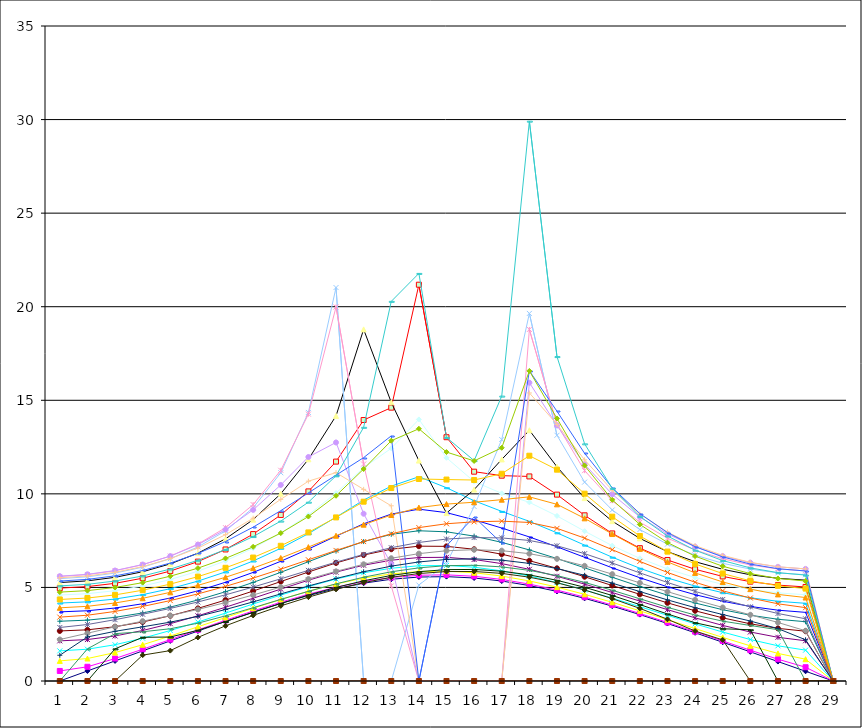
| Category | Series 0 | Series 1 | Series 2 | Series 3 | Series 4 | Series 5 | Series 6 | Series 7 | Series 8 | Series 9 | Series 10 | Series 11 | Series 12 | Series 13 | Series 14 | Series 15 | Series 16 | Series 17 | Series 18 | Series 19 | Series 20 | Series 21 | Series 22 | Series 23 | Series 24 | Series 25 | Series 26 | Series 27 | Series 28 |
|---|---|---|---|---|---|---|---|---|---|---|---|---|---|---|---|---|---|---|---|---|---|---|---|---|---|---|---|---|---|
| 0 | 0 | 0.537 | 1.074 | 1.61 | 2.145 | 2.675 | 3.194 | 3.694 | 4.165 | 4.593 | 4.963 | 5.26 | 5.471 | 5.586 | 5.601 | 5.517 | 5.341 | 5.082 | 4.751 | 4.357 | 3.91 | 3.413 | 2.859 | 2.215 | 1.375 | 0 | 0 | 0 | 0 |
| 1 | 0.537 | 0.759 | 1.201 | 1.699 | 2.215 | 2.735 | 3.251 | 3.754 | 4.23 | 4.666 | 5.045 | 5.351 | 5.568 | 5.686 | 5.7 | 5.613 | 5.431 | 5.165 | 4.829 | 4.433 | 3.991 | 3.514 | 3.019 | 2.553 | 2.354 | 1.715 | 0 | 0 | 0 |
| 2 | 1.074 | 1.201 | 1.519 | 1.938 | 2.407 | 2.899 | 3.401 | 3.899 | 4.38 | 4.826 | 5.22 | 5.54 | 5.768 | 5.891 | 5.904 | 5.809 | 5.617 | 5.342 | 4.998 | 4.601 | 4.168 | 3.718 | 3.278 | 2.897 | 2.656 | 2.53 | 1.719 | 0 | 0 |
| 3 | 1.609 | 1.698 | 1.938 | 2.284 | 2.698 | 3.155 | 3.636 | 4.128 | 4.614 | 5.077 | 5.493 | 5.837 | 6.084 | 6.214 | 6.222 | 6.114 | 5.905 | 5.613 | 5.256 | 4.852 | 4.42 | 3.984 | 3.566 | 3.197 | 2.896 | 2.632 | 2.336 | 1.384 | 0 |
| 4 | 2.143 | 2.212 | 2.405 | 2.697 | 3.064 | 3.486 | 3.948 | 4.436 | 4.933 | 5.421 | 5.874 | 6.259 | 6.536 | 6.677 | 6.673 | 6.54 | 6.301 | 5.981 | 5.599 | 5.178 | 4.737 | 4.297 | 3.879 | 3.495 | 3.145 | 2.791 | 2.35 | 1.624 | 0 |
| 5 | 2.67 | 2.73 | 2.895 | 3.151 | 3.484 | 3.881 | 4.329 | 4.819 | 5.337 | 5.867 | 6.379 | 6.831 | 7.161 | 7.315 | 7.283 | 7.102 | 6.814 | 6.45 | 6.03 | 5.577 | 5.111 | 4.655 | 4.223 | 3.824 | 3.453 | 3.091 | 2.711 | 2.329 | 0 |
| 6 | 3.185 | 3.243 | 3.393 | 3.629 | 3.942 | 4.325 | 4.771 | 5.275 | 5.829 | 6.422 | 7.029 | 7.596 | 8.025 | 8.192 | 8.091 | 7.819 | 7.454 | 7.026 | 6.552 | 6.049 | 5.543 | 5.057 | 4.605 | 4.193 | 3.82 | 3.481 | 3.178 | 2.948 | 0 |
| 7 | 3.681 | 3.74 | 3.886 | 4.114 | 4.422 | 4.807 | 5.267 | 5.802 | 6.412 | 7.098 | 7.85 | 8.622 | 9.255 | 9.427 | 9.145 | 8.699 | 8.221 | 7.719 | 7.171 | 6.597 | 6.031 | 5.5 | 5.02 | 4.596 | 4.228 | 3.915 | 3.666 | 3.504 | 0 |
| 8 | 4.146 | 4.21 | 4.359 | 4.592 | 4.91 | 5.314 | 5.807 | 6.397 | 7.091 | 7.907 | 8.873 | 10.006 | 11.128 | 11.259 | 10.477 | 9.707 | 9.103 | 8.543 | 7.904 | 7.226 | 6.571 | 5.978 | 5.46 | 5.02 | 4.653 | 4.36 | 4.143 | 4.014 | 0 |
| 9 | 4.568 | 4.639 | 4.797 | 5.044 | 5.384 | 5.824 | 6.375 | 7.051 | 7.873 | 8.875 | 10.132 | 11.847 | 14.349 | 14.26 | 11.97 | 10.677 | 10.053 | 9.555 | 8.788 | 7.941 | 7.155 | 6.477 | 5.91 | 5.447 | 5.076 | 4.791 | 4.592 | 4.481 | 0 |
| 10 | 4.933 | 5.012 | 5.183 | 5.449 | 5.819 | 6.309 | 6.94 | 7.74 | 8.754 | 10.044 | 11.724 | 14.165 | 21.025 | 19.985 | 12.746 | 11.135 | 10.999 | 10.964 | 9.899 | 8.741 | 7.762 | 6.977 | 6.352 | 5.859 | 5.477 | 5.193 | 5.001 | 4.898 | 0 |
| 11 | 5.226 | 5.314 | 5.497 | 5.783 | 6.187 | 6.731 | 7.451 | 8.401 | 9.667 | 11.398 | 13.945 | 18.788 | 0 | 11.593 | 8.938 | 10.24 | 11.936 | 13.555 | 11.329 | 9.582 | 8.354 | 7.451 | 6.764 | 6.237 | 5.837 | 5.546 | 5.355 | 5.256 | 0 |
| 12 | 5.437 | 5.53 | 5.723 | 6.025 | 6.455 | 7.043 | 7.837 | 8.918 | 10.411 | 12.432 | 14.606 | 14.889 | 0 | 5.08 | 6.253 | 9.36 | 13.1 | 20.286 | 12.839 | 10.311 | 8.87 | 7.867 | 7.122 | 6.559 | 6.138 | 5.836 | 5.64 | 5.542 | 0 |
| 13 | 5.555 | 5.651 | 5.848 | 6.158 | 6.599 | 7.204 | 8.028 | 9.181 | 10.914 | 13.977 | 21.176 | 11.777 | 5.127 | 0 | 0 | 0 | 0 | 21.779 | 13.478 | 10.794 | 9.265 | 8.197 | 7.403 | 6.806 | 6.362 | 6.046 | 5.843 | 5.743 | 0 |
| 14 | 5.577 | 5.673 | 5.869 | 6.175 | 6.609 | 7.195 | 7.973 | 8.996 | 10.327 | 11.927 | 13.027 | 8.972 | 6.268 | 0 | 0 | 0 | 7.228 | 13.014 | 12.233 | 10.764 | 9.454 | 8.402 | 7.585 | 6.961 | 6.495 | 6.165 | 5.952 | 5.848 | 0 |
| 15 | 5.504 | 5.596 | 5.786 | 6.08 | 6.493 | 7.04 | 7.742 | 8.613 | 9.633 | 10.654 | 11.185 | 10.228 | 9.324 | 0 | 0 | 0 | 8.76 | 11.775 | 11.76 | 10.739 | 9.553 | 8.507 | 7.665 | 7.015 | 6.529 | 6.183 | 5.961 | 5.852 | 0 |
| 16 | 5.342 | 5.428 | 5.608 | 5.886 | 6.272 | 6.776 | 7.408 | 8.174 | 9.064 | 10.028 | 10.972 | 11.84 | 12.903 | 0 | 0 | 0 | 7.362 | 15.223 | 12.462 | 11.074 | 9.69 | 8.541 | 7.646 | 6.965 | 6.458 | 6.098 | 5.866 | 5.75 | 0 |
| 17 | 5.099 | 5.178 | 5.347 | 5.608 | 5.966 | 6.429 | 7.003 | 7.698 | 8.53 | 9.546 | 10.931 | 13.398 | 19.642 | 18.785 | 15.94 | 15.392 | 16.574 | 29.914 | 16.569 | 12.038 | 9.84 | 8.471 | 7.51 | 6.803 | 6.283 | 5.912 | 5.67 | 5.547 | 0 |
| 18 | 4.786 | 4.858 | 5.016 | 5.261 | 5.595 | 6.021 | 6.544 | 7.171 | 7.918 | 8.822 | 9.96 | 11.445 | 13.131 | 13.697 | 13.654 | 13.714 | 14.413 | 17.334 | 14.029 | 11.292 | 9.44 | 8.156 | 7.223 | 6.527 | 6.008 | 5.631 | 5.38 | 5.248 | 0 |
| 19 | 4.416 | 4.482 | 4.631 | 4.863 | 5.177 | 5.572 | 6.049 | 6.61 | 7.259 | 8.005 | 8.853 | 9.772 | 10.626 | 11.24 | 11.583 | 11.818 | 12.164 | 12.673 | 11.512 | 10.01 | 8.692 | 7.635 | 6.804 | 6.153 | 5.648 | 5.269 | 5.008 | 4.863 | 0 |
| 20 | 4 | 4.06 | 4.204 | 4.428 | 4.729 | 5.102 | 5.543 | 6.049 | 6.614 | 7.232 | 7.887 | 8.541 | 9.138 | 9.633 | 9.976 | 10.192 | 10.325 | 10.293 | 9.681 | 8.78 | 7.854 | 7.018 | 6.304 | 5.711 | 5.228 | 4.848 | 4.569 | 4.404 | 0 |
| 21 | 3.548 | 3.606 | 3.749 | 3.973 | 4.269 | 4.631 | 5.049 | 5.517 | 6.024 | 6.557 | 7.097 | 7.619 | 8.091 | 8.484 | 8.764 | 8.921 | 8.947 | 8.794 | 8.366 | 7.748 | 7.061 | 6.39 | 5.778 | 5.241 | 4.78 | 4.393 | 4.084 | 3.88 | 0 |
| 22 | 3.071 | 3.128 | 3.278 | 3.51 | 3.813 | 4.176 | 4.586 | 5.034 | 5.507 | 5.99 | 6.466 | 6.914 | 7.311 | 7.633 | 7.854 | 7.958 | 7.929 | 7.748 | 7.398 | 6.915 | 6.364 | 5.802 | 5.265 | 4.775 | 4.334 | 3.937 | 3.581 | 3.298 | 0 |
| 23 | 2.577 | 2.637 | 2.801 | 3.052 | 3.375 | 3.752 | 4.169 | 4.613 | 5.071 | 5.528 | 5.969 | 6.375 | 6.725 | 6.998 | 7.174 | 7.238 | 7.178 | 6.989 | 6.672 | 6.255 | 5.776 | 5.276 | 4.789 | 4.335 | 3.92 | 3.524 | 3.112 | 2.67 | 0 |
| 24 | 2.07 | 2.14 | 2.33 | 2.615 | 2.971 | 3.374 | 3.809 | 4.261 | 4.718 | 5.165 | 5.588 | 5.969 | 6.289 | 6.53 | 6.675 | 6.711 | 6.631 | 6.435 | 6.131 | 5.74 | 5.292 | 4.82 | 4.356 | 3.928 | 3.55 | 3.198 | 2.791 | 2.194 | 0 |
| 25 | 1.557 | 1.644 | 1.879 | 2.216 | 2.617 | 3.055 | 3.515 | 3.983 | 4.447 | 4.894 | 5.309 | 5.677 | 5.979 | 6.199 | 6.323 | 6.341 | 6.246 | 6.043 | 5.739 | 5.353 | 4.909 | 4.434 | 3.963 | 3.538 | 3.204 | 2.966 | 2.737 | 0 | 0 |
| 26 | 1.039 | 1.164 | 1.474 | 1.881 | 2.335 | 2.812 | 3.299 | 3.784 | 4.259 | 4.71 | 5.124 | 5.486 | 5.779 | 5.988 | 6.099 | 6.104 | 6 | 5.788 | 5.479 | 5.086 | 4.627 | 4.125 | 3.607 | 3.128 | 2.8 | 2.741 | 0 | 0 | 0 |
| 27 | 0.52 | 0.736 | 1.165 | 1.648 | 2.15 | 2.659 | 3.167 | 3.668 | 4.152 | 4.609 | 5.026 | 5.388 | 5.679 | 5.884 | 5.99 | 5.989 | 5.878 | 5.659 | 5.342 | 4.937 | 4.46 | 3.919 | 3.323 | 2.685 | 2.202 | 0 | 0 | 0 | 0 |
| 28 | 0 | 0 | 0 | 0 | 0 | 0 | 0 | 0 | 0 | 0 | 0 | 0 | 0 | 0 | 0 | 0 | 0 | 0 | 0 | 0 | 0 | 0 | 0 | 0 | 0 | 0 | 0 | 0 | 0 |